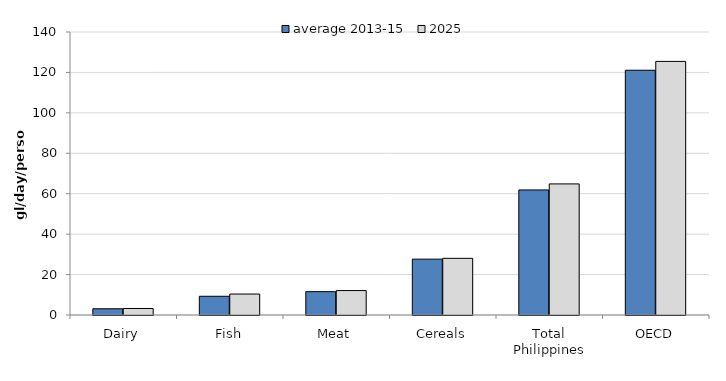
| Category | average 2013-15 | 2025 |
|---|---|---|
| Dairy | 3.078 | 3.221 |
| Fish | 9.266 | 10.372 |
| Meat | 11.541 | 12.086 |
| Cereals | 27.629 | 28.041 |
| Total Philippines | 61.865 | 64.851 |
| OECD | 121.086 | 125.457 |